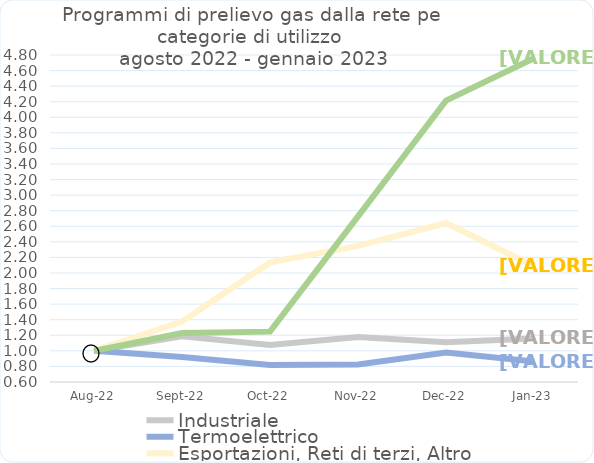
| Category | Industriale | Termoelettrico | Esportazioni, Reti di terzi, Altro | Reti di distribuzione |
|---|---|---|---|---|
| 2022-08-01 | 1 | 1 | 1 | 1 |
| 2022-09-01 | 1.186 | 0.92 | 1.377 | 1.229 |
| 2022-10-01 | 1.075 | 0.819 | 2.136 | 1.247 |
| 2022-11-01 | 1.178 | 0.826 | 2.349 | 2.726 |
| 2022-12-01 | 1.111 | 0.978 | 2.642 | 4.214 |
| 2023-01-01 | 1.159 | 0.862 | 2.087 | 4.758 |